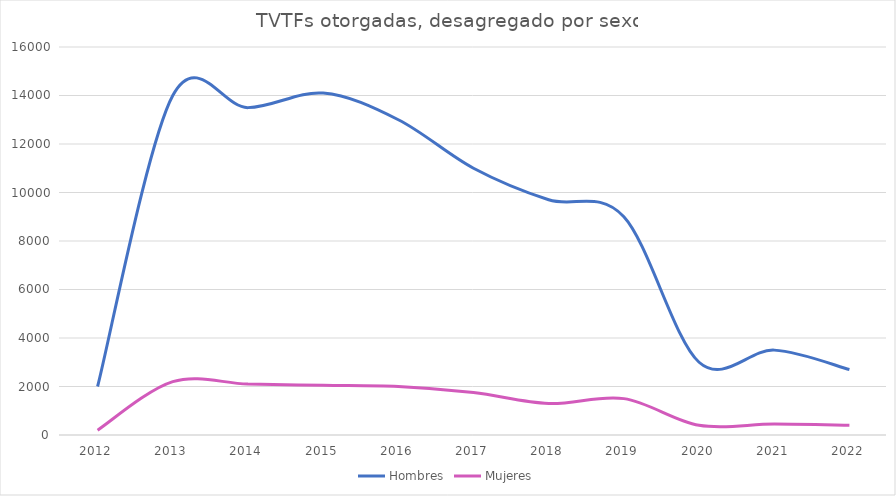
| Category | Hombres | Mujeres |
|---|---|---|
| 2012.0 | 2000 | 200 |
| 2013.0 | 14000 | 2200 |
| 2014.0 | 13500 | 2100 |
| 2015.0 | 14100 | 2050 |
| 2016.0 | 13000 | 2000 |
| 2017.0 | 11000 | 1750 |
| 2018.0 | 9700 | 1300 |
| 2019.0 | 9000 | 1500 |
| 2020.0 | 3000 | 400 |
| 2021.0 | 3500 | 450 |
| 2022.0 | 2700 | 400 |